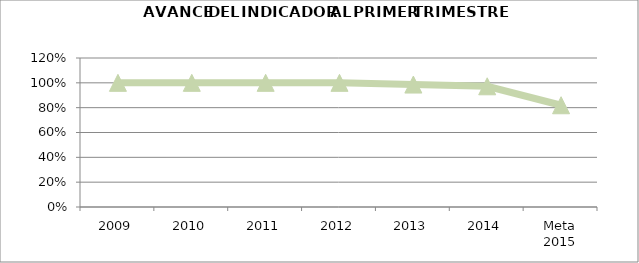
| Category | Series 2 |
|---|---|
| 2009 | 1 |
| 2010 | 1 |
| 2011 | 1 |
| 2012 | 1 |
| 2013 | 0.986 |
| 2014 | 0.972 |
| Meta 2015 | 0.819 |